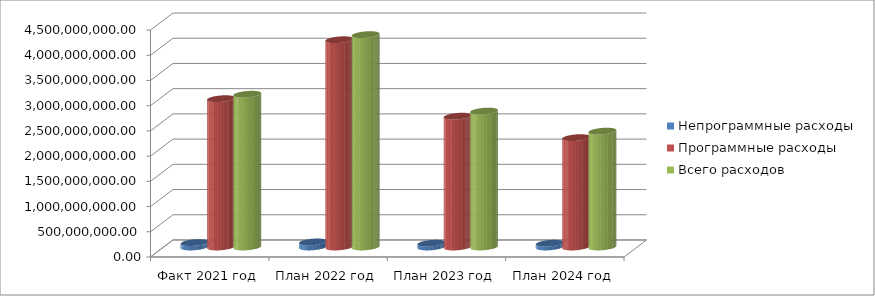
| Category | Непрограммные расходы | Программные расходы | Всего расходов |
|---|---|---|---|
| Факт 2021 год | 88271042.59 | 2940800625.65 | 3029071668.24 |
| План 2022 год | 100729160.81 | 4109713701.03 | 4210442861.84 |
| План 2023 год | 74905639 | 2593865264.93 | 2694770903.93 |
| План 2024 год | 74924210 | 2168270883.59 | 2296795093.59 |